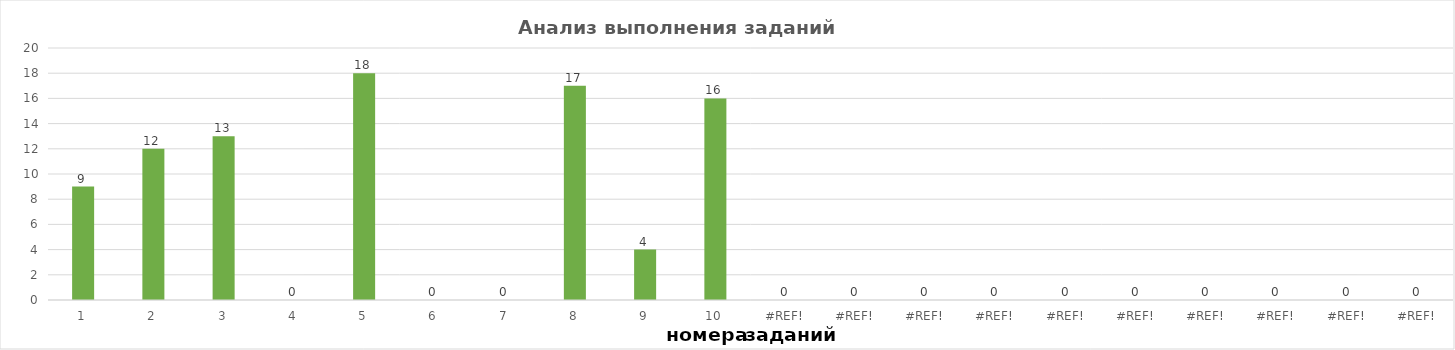
| Category | задания |
|---|---|
| 1.0 | 9 |
| 2.0 | 12 |
| 3.0 | 13 |
| 4.0 | 0 |
| 5.0 | 18 |
| 6.0 | 0 |
| 7.0 | 0 |
| 8.0 | 17 |
| 9.0 | 4 |
| 10.0 | 16 |
| 0.0 | 0 |
| 0.0 | 0 |
| 0.0 | 0 |
| 0.0 | 0 |
| 0.0 | 0 |
| 0.0 | 0 |
| 0.0 | 0 |
| 0.0 | 0 |
| 0.0 | 0 |
| 0.0 | 0 |